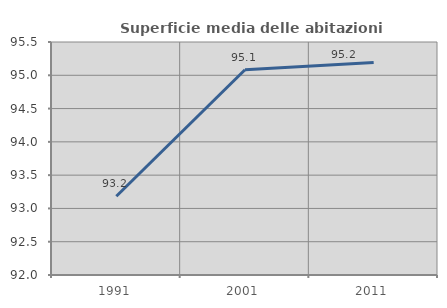
| Category | Superficie media delle abitazioni occupate |
|---|---|
| 1991.0 | 93.182 |
| 2001.0 | 95.083 |
| 2011.0 | 95.191 |